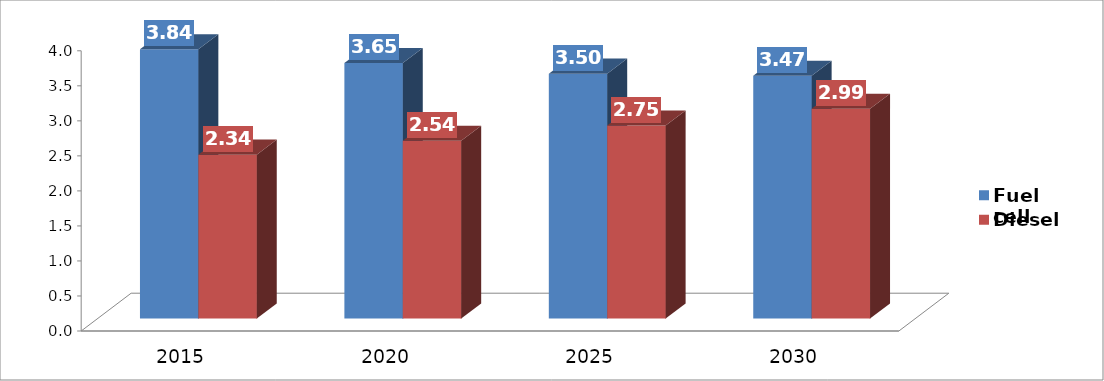
| Category | Fuel cell | Diesel |
|---|---|---|
| 2015.0 | 3.843 | 2.34 |
| 2020.0 | 3.648 | 2.538 |
| 2025.0 | 3.496 | 2.755 |
| 2030.0 | 3.466 | 2.994 |